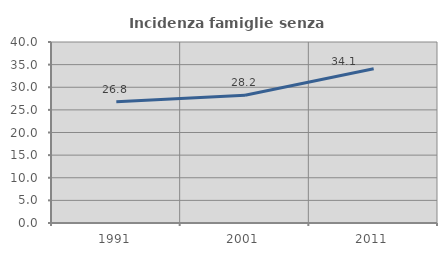
| Category | Incidenza famiglie senza nuclei |
|---|---|
| 1991.0 | 26.775 |
| 2001.0 | 28.22 |
| 2011.0 | 34.07 |